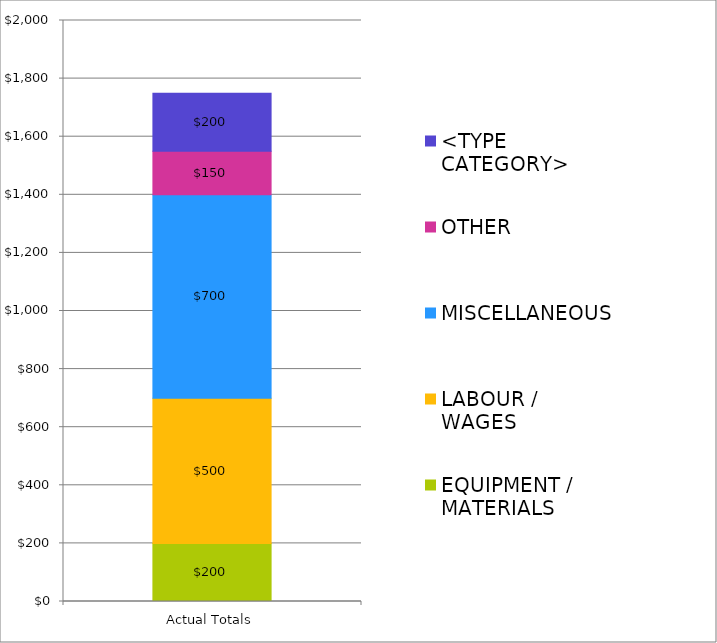
| Category | EQUIPMENT / MATERIALS | LABOUR / WAGES | MISCELLANEOUS | OTHER | <TYPE CATEGORY> |
|---|---|---|---|---|---|
| Actual Totals | 200 | 500 | 700 | 150 | 200 |